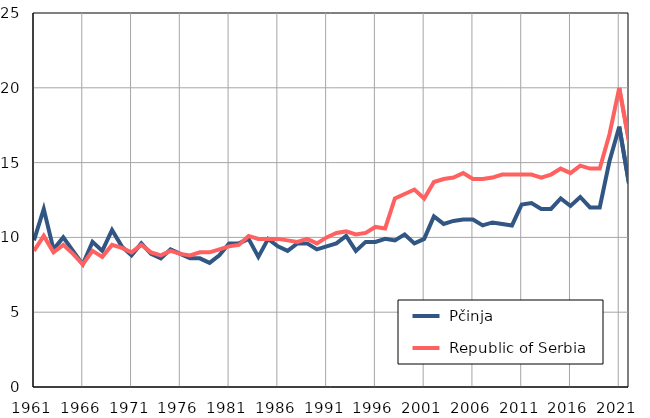
| Category |  Pčinja |  Republic of Serbia |
|---|---|---|
| 1961.0 | 9.8 | 9.1 |
| 1962.0 | 11.9 | 10.1 |
| 1963.0 | 9.2 | 9 |
| 1964.0 | 10 | 9.5 |
| 1965.0 | 9.1 | 8.9 |
| 1966.0 | 8.2 | 8.2 |
| 1967.0 | 9.7 | 9.1 |
| 1968.0 | 9.1 | 8.7 |
| 1969.0 | 10.5 | 9.5 |
| 1970.0 | 9.4 | 9.3 |
| 1971.0 | 8.8 | 9 |
| 1972.0 | 9.6 | 9.5 |
| 1973.0 | 8.9 | 9 |
| 1974.0 | 8.6 | 8.8 |
| 1975.0 | 9.2 | 9.1 |
| 1976.0 | 8.9 | 8.9 |
| 1977.0 | 8.6 | 8.8 |
| 1978.0 | 8.6 | 9 |
| 1979.0 | 8.3 | 9 |
| 1980.0 | 8.8 | 9.2 |
| 1981.0 | 9.6 | 9.4 |
| 1982.0 | 9.6 | 9.5 |
| 1983.0 | 9.9 | 10.1 |
| 1984.0 | 8.7 | 9.9 |
| 1985.0 | 9.9 | 9.9 |
| 1986.0 | 9.4 | 9.9 |
| 1987.0 | 9.1 | 9.8 |
| 1988.0 | 9.6 | 9.7 |
| 1989.0 | 9.6 | 9.9 |
| 1990.0 | 9.2 | 9.6 |
| 1991.0 | 9.4 | 10 |
| 1992.0 | 9.6 | 10.3 |
| 1993.0 | 10.1 | 10.4 |
| 1994.0 | 9.1 | 10.2 |
| 1995.0 | 9.7 | 10.3 |
| 1996.0 | 9.7 | 10.7 |
| 1997.0 | 9.9 | 10.6 |
| 1998.0 | 9.8 | 12.6 |
| 1999.0 | 10.2 | 12.9 |
| 2000.0 | 9.6 | 13.2 |
| 2001.0 | 9.9 | 12.6 |
| 2002.0 | 11.4 | 13.7 |
| 2003.0 | 10.9 | 13.9 |
| 2004.0 | 11.1 | 14 |
| 2005.0 | 11.2 | 14.3 |
| 2006.0 | 11.2 | 13.9 |
| 2007.0 | 10.8 | 13.9 |
| 2008.0 | 11 | 14 |
| 2009.0 | 10.9 | 14.2 |
| 2010.0 | 10.8 | 14.2 |
| 2011.0 | 12.2 | 14.2 |
| 2012.0 | 12.3 | 14.2 |
| 2013.0 | 11.9 | 14 |
| 2014.0 | 11.9 | 14.2 |
| 2015.0 | 12.6 | 14.6 |
| 2016.0 | 12.1 | 14.3 |
| 2017.0 | 12.7 | 14.8 |
| 2018.0 | 12 | 14.6 |
| 2019.0 | 12 | 14.6 |
| 2020.0 | 15.1 | 16.9 |
| 2021.0 | 17.4 | 20 |
| 2022.0 | 13.6 | 16.4 |